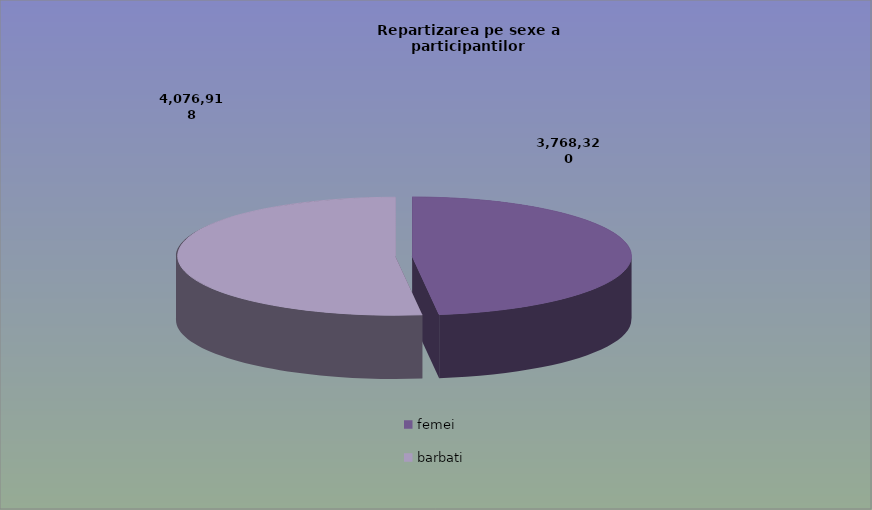
| Category | Series 0 |
|---|---|
| femei | 3768320 |
| barbati | 4076918 |